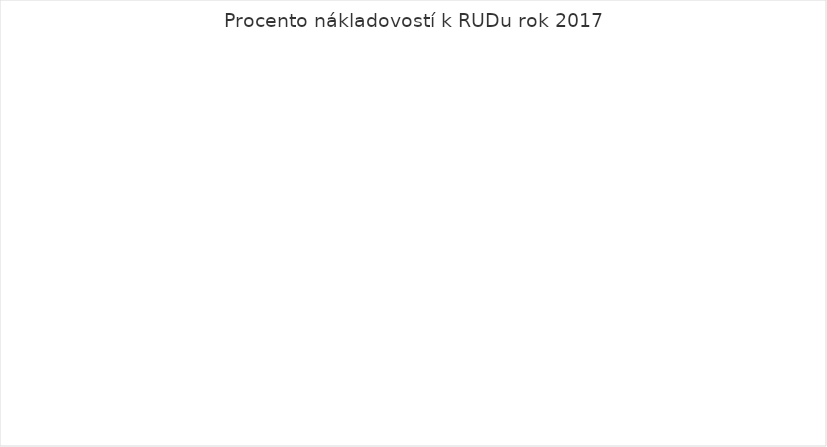
| Category | Series 0 |
|---|---|
| Osobní náklady  | 0 |
| Neinvest. výdaje bez mezd | 0 |
| Investiční výdaje  | 0 |
| Celkem  výdaje  | 0 |